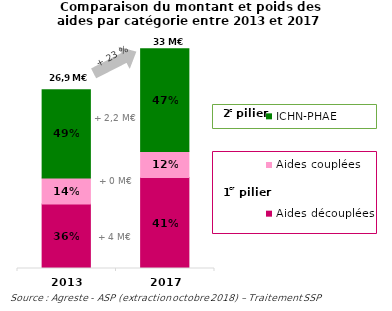
| Category | Aides découplées | Aides couplées   | ICHN-PHAE |
|---|---|---|---|
| 2013.0 | 9.694 | 3.888 | 13.282 |
| 2017.0 | 13.651 | 3.931 | 15.446 |